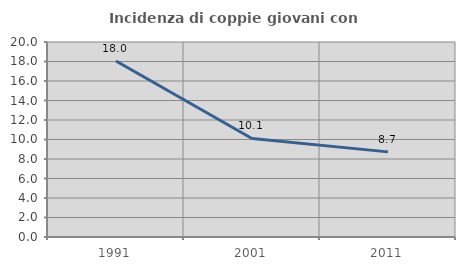
| Category | Incidenza di coppie giovani con figli |
|---|---|
| 1991.0 | 18.049 |
| 2001.0 | 10.108 |
| 2011.0 | 8.73 |